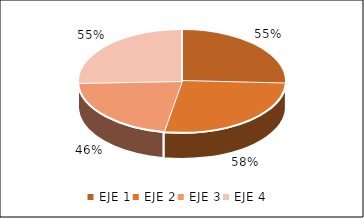
| Category | Series 0 |
|---|---|
| EJE 1 | 0.552 |
| EJE 2 | 0.578 |
| EJE 3 | 0.461 |
| EJE 4 | 0.548 |